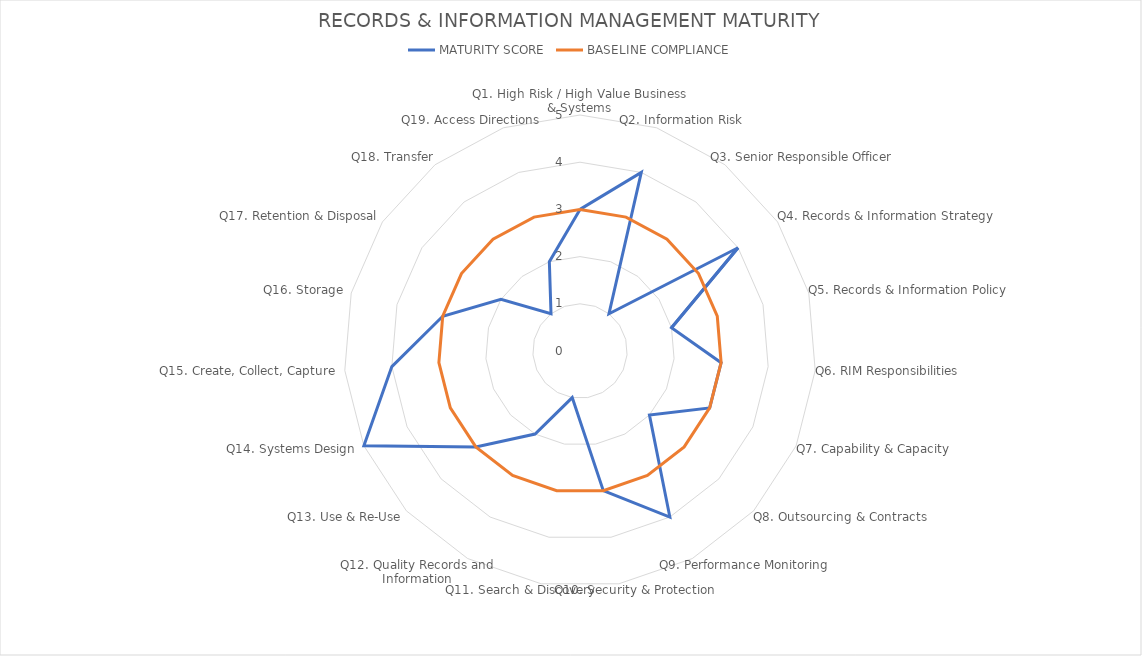
| Category | MATURITY SCORE | BASELINE COMPLIANCE |
|---|---|---|
| Q1. High Risk / High Value Business & Systems | 3 | 3 |
| Q2. Information Risk | 4 | 3 |
| Q3. Senior Responsible Officer | 1 | 3 |
| Q4. Records & Information Strategy | 4 | 3 |
| Q5. Records & Information Policy | 2 | 3 |
| Q6. RIM Responsibilities | 3 | 3 |
| Q7. Capability & Capacity  | 3 | 3 |
| Q8. Outsourcing & Contracts | 2 | 3 |
| Q9. Performance Monitoring  | 4 | 3 |
| Q10. Security & Protection | 3 | 3 |
| Q11. Search & Discovery  | 1 | 3 |
| Q12. Quality Records and Information | 2 | 3 |
| Q13. Use & Re-Use | 3 | 3 |
| Q14. Systems Design  | 5 | 3 |
| Q15. Create, Collect, Capture  | 4 | 3 |
| Q16. Storage  | 3 | 3 |
| Q17. Retention & Disposal | 2 | 3 |
| Q18. Transfer  | 1 | 3 |
| Q19. Access Directions | 2 | 3 |